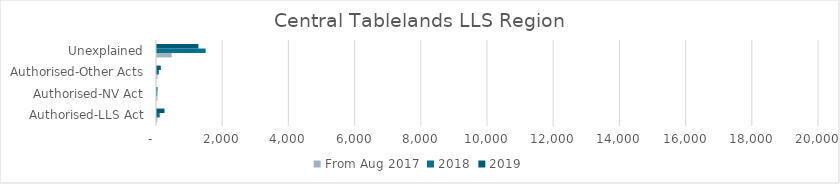
| Category | From Aug 2017 | 2018 | 2019 |
|---|---|---|---|
| Authorised-LLS Act | 9 | 81 | 226 |
| Authorised-NV Act | 14 | 10 | 15 |
| Authorised-Other Acts | 16 | 56 | 115 |
| Unexplained | 445 | 1470 | 1251 |